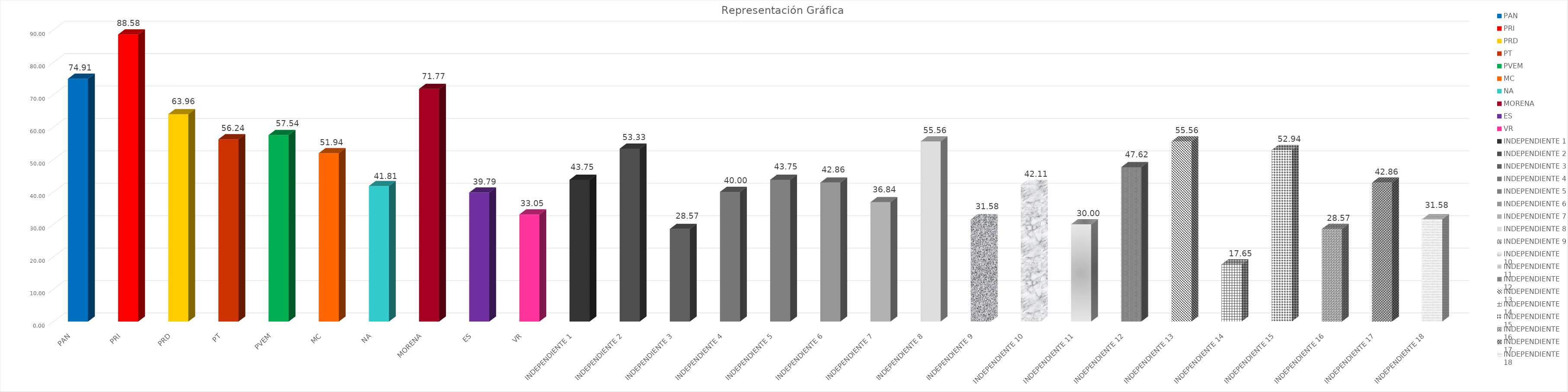
| Category | Series 0 |
|---|---|
| PAN | 74.907 |
| PRI | 88.575 |
| PRD | 63.957 |
| PT | 56.243 |
| PVEM | 57.542 |
| MC | 51.943 |
| NA | 41.806 |
| MORENA | 71.77 |
| ES | 39.788 |
| VR | 33.051 |
| INDEPENDIENTE 1 | 43.75 |
| INDEPENDIENTE 2 | 53.333 |
| INDEPENDIENTE 3 | 28.571 |
| INDEPENDIENTE 4 | 40 |
| INDEPENDIENTE 5 | 43.75 |
| INDEPENDIENTE 6 | 42.857 |
| INDEPENDIENTE 7 | 36.842 |
| INDEPENDIENTE 8 | 55.556 |
| INDEPENDIENTE 9 | 31.579 |
| INDEPENDIENTE 10 | 42.105 |
| INDEPENDIENTE 11 | 30 |
| INDEPENDIENTE 12 | 47.619 |
| INDEPENDIENTE 13 | 55.556 |
| INDEPENDIENTE 14 | 17.647 |
| INDEPENDIENTE 15 | 52.941 |
| INDEPENDIENTE 16 | 28.571 |
| INDEPENDIENTE 17 | 42.857 |
| INDEPENDIENTE 18 | 31.579 |